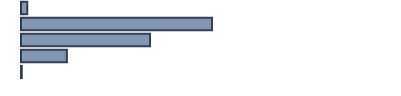
| Category | Series 0 |
|---|---|
| 0 | 1.7 |
| 1 | 51.2 |
| 2 | 34.6 |
| 3 | 12.3 |
| 4 | 0.2 |